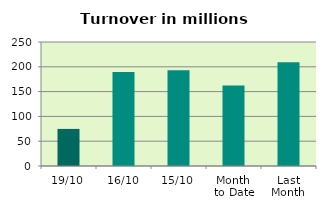
| Category | Series 0 |
|---|---|
| 19/10 | 74.773 |
| 16/10 | 189.306 |
| 15/10 | 193.161 |
| Month 
to Date | 162.373 |
| Last
Month | 209.117 |